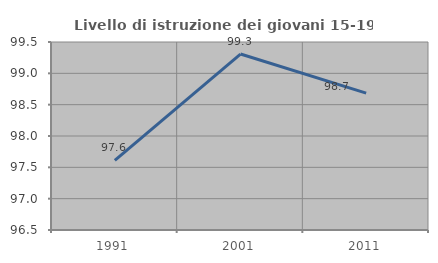
| Category | Livello di istruzione dei giovani 15-19 anni |
|---|---|
| 1991.0 | 97.61 |
| 2001.0 | 99.308 |
| 2011.0 | 98.684 |